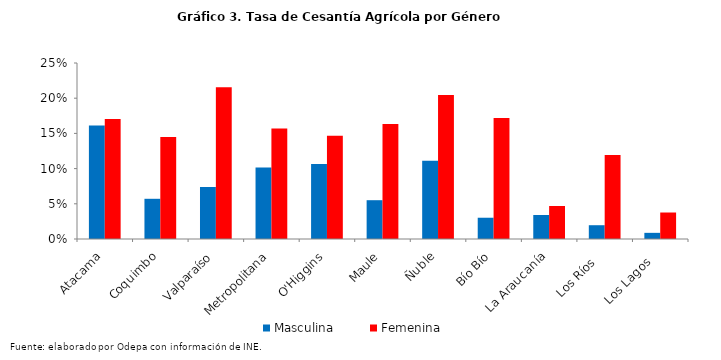
| Category | Masculina | Femenina |
|---|---|---|
| Atacama | 0.161 | 0.17 |
| Coquimbo | 0.057 | 0.145 |
| Valparaíso | 0.074 | 0.215 |
| Metropolitana | 0.102 | 0.157 |
| O'Higgins | 0.106 | 0.146 |
| Maule | 0.055 | 0.164 |
| Ñuble | 0.111 | 0.204 |
| Bío Bío | 0.03 | 0.172 |
| La Araucanía | 0.034 | 0.047 |
| Los Ríos   | 0.02 | 0.119 |
| Los Lagos   | 0.009 | 0.038 |